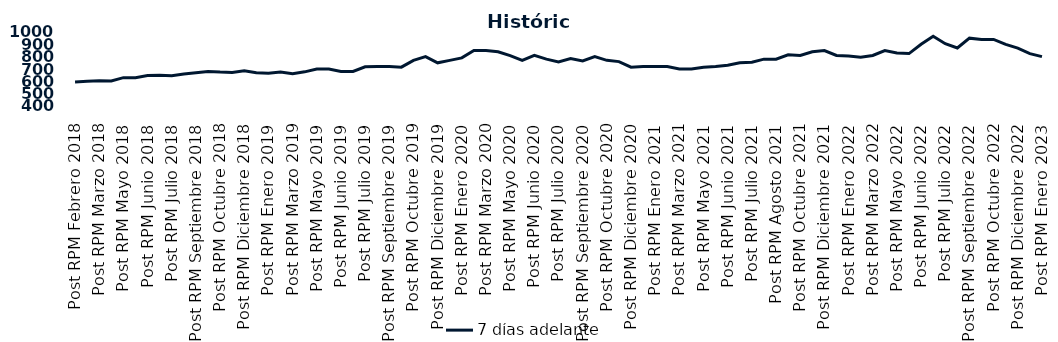
| Category | 7 días adelante  |
|---|---|
| Post RPM Febrero 2018 | 595 |
| Pre RPM Marzo 2018 | 600 |
| Post RPM Marzo 2018 | 605 |
| Pre RPM Mayo 2018 | 603 |
| Post RPM Mayo 2018 | 630 |
| Pre RPM Junio 2018 | 630 |
| Post RPM Junio 2018 | 646.5 |
| Pre RPM Julio 2018 | 650 |
| Post RPM Julio 2018 | 645 |
| Pre RPM Septiembre 2018 | 660 |
| Post RPM Septiembre 2018 | 670 |
| Pre RPM Octubre 2018 | 680 |
| Post RPM Octubre 2018 | 675 |
| Pre RPM Diciembre 2018 | 672.5 |
| Post RPM Diciembre 2018 | 685 |
| Pre RPM Enero 2019 | 670 |
| Post RPM Enero 2019 | 665 |
| Pre RPM Marzo 2019 | 675 |
| Post RPM Marzo 2019 | 661 |
| Pre RPM Mayo 2019 | 677 |
| Post RPM Mayo 2019 | 700 |
| Pre RPM Junio 2019 | 700.5 |
| Post RPM Junio 2019 | 680 |
| Pre RPM Julio 2019 | 680 |
| Post RPM Julio 2019 | 717.5 |
| Pre RPM Septiembre 2019 | 720 |
| Post RPM Septiembre 2019 | 720 |
| Pre RPM Octubre 2019 | 715 |
| Post RPM Octubre 2019 | 770 |
| Pre RPM Diciembre 2019 | 800 |
| Post RPM Diciembre 2019 | 750 |
| Pre RPM Enero 2020 | 770 |
| Post RPM Enero 2020 | 790 |
| Pre RPM Marzo 2020 | 850 |
| Post RPM Marzo 2020 | 850 |
| Pre RPM Mayo 2020 | 840 |
| Post RPM Mayo 2020 | 808.5 |
| Pre RPM Junio 2020 | 770 |
| Post RPM Junio 2020 | 810 |
| Pre RPM Julio 2020 | 780 |
| Post RPM Julio 2020 | 757 |
| Pre RPM Septiembre 2020 | 785 |
| Post RPM Septiembre 2020 | 765 |
| Pre RPM Octubre 2020 | 800 |
| Post RPM Octubre 2020 | 770 |
| Pre RPM Diciembre 2020 | 760 |
| Post RPM Diciembre 2020 | 715 |
| Pre RPM Enero 2021 | 720 |
| Post RPM Enero 2021 | 720 |
| Pre RPM Marzo 2021 | 720 |
| Post RPM Marzo 2021 | 700 |
| Pre RPM Mayo 2021 | 700 |
| Post RPM Mayo 2021 | 715 |
| Pre RPM Junio 2021 | 720 |
| Post RPM Junio 2021 | 730 |
| Pre RPM Julio 2021 | 750 |
| Post RPM Julio 2021 | 755 |
| Pre RPM Agosto 2021 | 780 |
| Post RPM Agosto 2021 | 780 |
| Pre RPM Octubre 2021 | 815 |
| Post RPM Octubre 2021 | 810 |
| Pre RPM Diciembre 2021 | 840 |
| Post RPM Diciembre 2021 | 850 |
| Pre RPM Enero 2022 | 810 |
| Post RPM Enero 2022 | 805 |
| Pre RPM Marzo 2022 | 795 |
| Post RPM Marzo 2022 | 810 |
| Pre RPM Mayo 2022 | 850 |
| Post RPM Mayo 2022 | 830 |
| Pre RPM Junio 2022 | 825 |
| Post RPM Junio 2022 | 900 |
| Pre RPM Julio 2022 | 965 |
| Post RPM Julio 2022 | 905 |
| Pre RPM Septiembre 2022 | 870 |
| Post RPM Septiembre 2022 | 950 |
| Pre RPM Octubre 2022 | 940 |
| Post RPM Octubre 2022 | 940 |
| Pre RPM Diciembre 2022 | 900 |
| Post RPM Diciembre 2022 | 870 |
| Pre RPM Enero 2023 | 825 |
| Post RPM Enero 2023 | 800 |